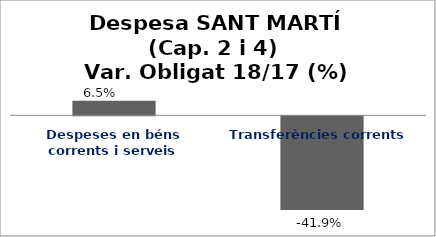
| Category | Series 0 |
|---|---|
| Despeses en béns corrents i serveis | 0.065 |
| Transferències corrents | -0.419 |